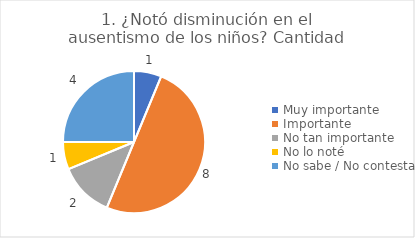
| Category | 1. ¿Notó disminución en el ausentismo de los niños? |
|---|---|
| Muy importante  | 0.062 |
| Importante  | 0.5 |
| No tan importante  | 0.125 |
| No lo noté  | 0.062 |
| No sabe / No contesta | 0.25 |